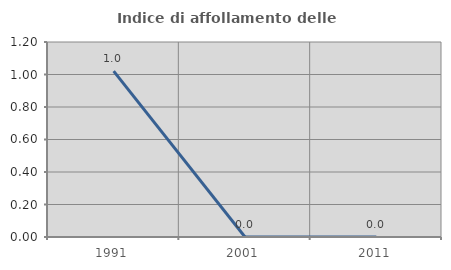
| Category | Indice di affollamento delle abitazioni  |
|---|---|
| 1991.0 | 1.02 |
| 2001.0 | 0 |
| 2011.0 | 0 |